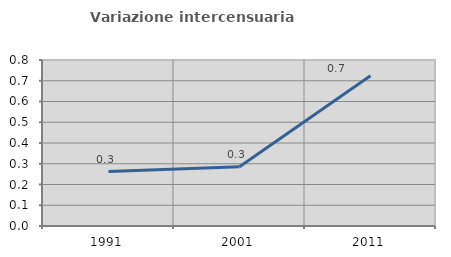
| Category | Variazione intercensuaria annua |
|---|---|
| 1991.0 | 0.262 |
| 2001.0 | 0.286 |
| 2011.0 | 0.724 |